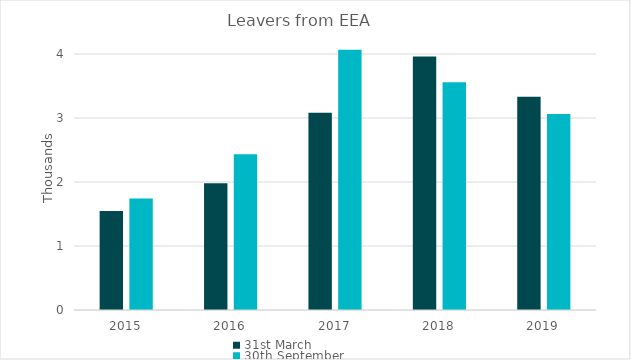
| Category | 31st March | 30th September |
|---|---|---|
| 2015.0 | 1545 | 1743 |
| 2016.0 | 1981 | 2435 |
| 2017.0 | 3081 | 4067 |
| 2018.0 | 3962 | 3560 |
| 2019.0 | 3333 | 3064 |